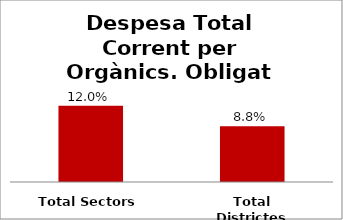
| Category | Series 0 |
|---|---|
| Total Sectors | 0.12 |
| Total Districtes | 0.088 |